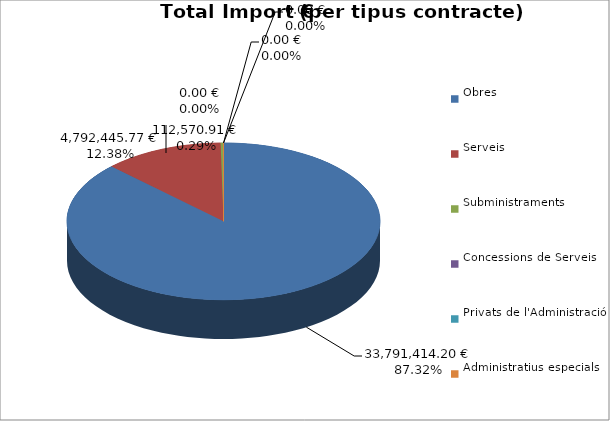
| Category | Total preu
(amb IVA) |
|---|---|
| Obres | 33791414.203 |
| Serveis | 4792445.773 |
| Subministraments | 112570.91 |
| Concessions de Serveis | 0 |
| Privats de l'Administració | 0 |
| Administratius especials | 0 |